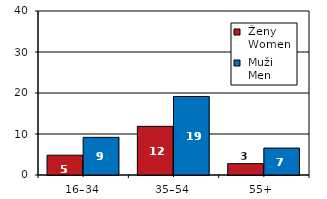
| Category |  Ženy 
 Women |  Muži 
 Men |
|---|---|---|
| 16–34 | 4.83 | 9.18 |
| 35–54 | 11.86 | 19.15 |
| 55+  | 2.77 | 6.57 |